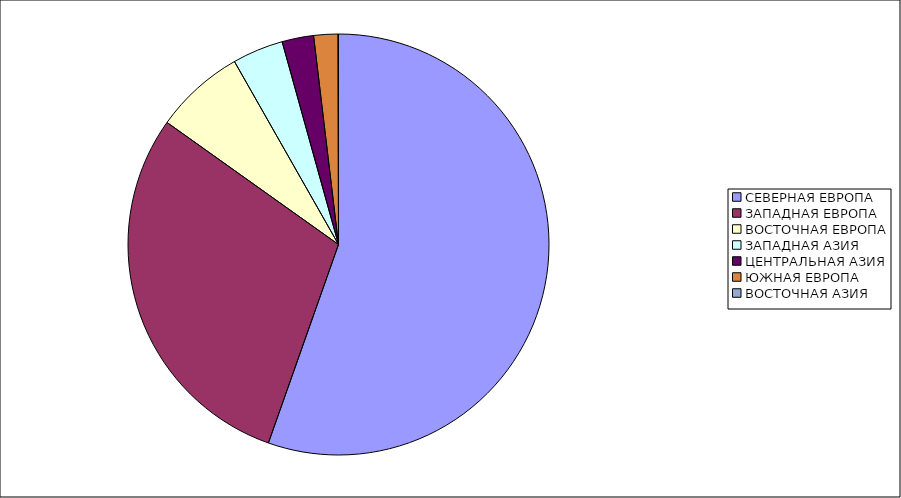
| Category | Оборот |
|---|---|
| СЕВЕРНАЯ ЕВРОПА | 55.403 |
| ЗАПАДНАЯ ЕВРОПА | 29.441 |
| ВОСТОЧНАЯ ЕВРОПА | 6.926 |
| ЗАПАДНАЯ АЗИЯ | 3.914 |
| ЦЕНТРАЛЬНАЯ АЗИЯ | 2.423 |
| ЮЖНАЯ ЕВРОПА | 1.86 |
| ВОСТОЧНАЯ АЗИЯ | 0.033 |